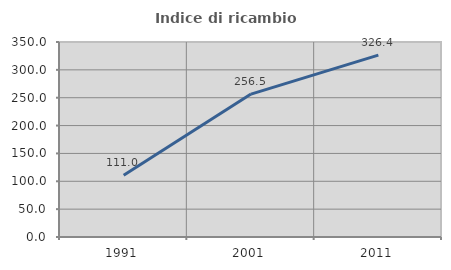
| Category | Indice di ricambio occupazionale  |
|---|---|
| 1991.0 | 110.976 |
| 2001.0 | 256.522 |
| 2011.0 | 326.415 |